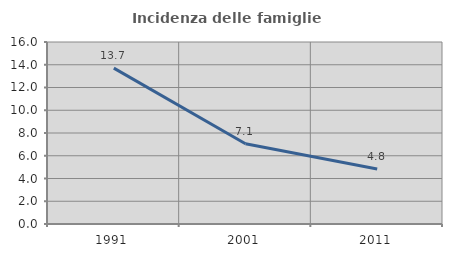
| Category | Incidenza delle famiglie numerose |
|---|---|
| 1991.0 | 13.702 |
| 2001.0 | 7.061 |
| 2011.0 | 4.827 |